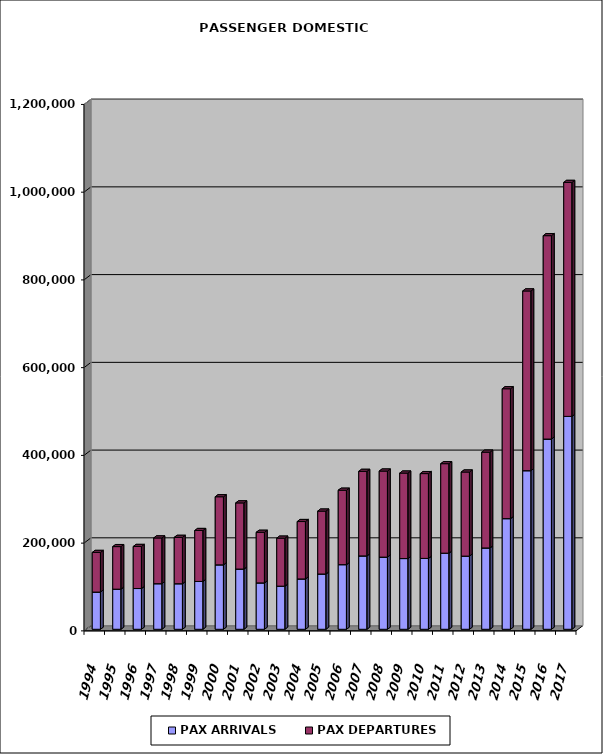
| Category | PAX ARRIVALS | PAX DEPARTURES |
|---|---|---|
| 1994.0 | 84825 | 90327 |
| 1995.0 | 91425 | 97036 |
| 1996.0 | 92893 | 95885 |
| 1997.0 | 103896 | 104299 |
| 1998.0 | 103817 | 105688 |
| 1999.0 | 109042 | 116118 |
| 2000.0 | 146885 | 155187 |
| 2001.0 | 137314 | 150770 |
| 2002.0 | 105704 | 115336 |
| 2003.0 | 98301 | 109394 |
| 2004.0 | 114742 | 130835 |
| 2005.0 | 126006 | 143365 |
| 2006.0 | 147322 | 169651 |
| 2007.0 | 167242 | 192708 |
| 2008.0 | 164483 | 196187 |
| 2009.0 | 161220 | 194820 |
| 2010.0 | 161553 | 193319 |
| 2011.0 | 173496 | 203977 |
| 2012.0 | 166786 | 191682 |
| 2013.0 | 185378 | 218309 |
| 2014.0 | 252223 | 296051 |
| 2015.0 | 361525 | 409668 |
| 2016.0 | 433598 | 463633 |
| 2017.0 | 485286 | 533351 |